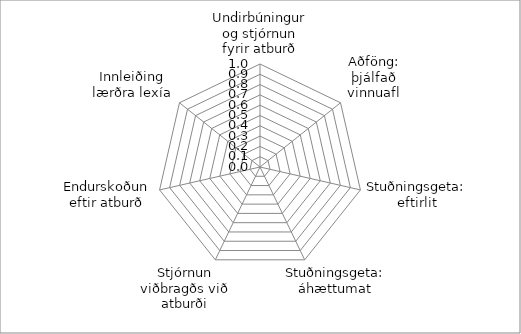
| Category | Series 0 |
|---|---|
| Undirbúningur og stjórnun fyrir atburð | 0 |
| Aðföng: þjálfað vinnuafl | 0 |
| Stuðningsgeta: eftirlit | 0 |
| Stuðningsgeta: áhættumat | 0 |
| Stjórnun viðbragðs við atburði | 0 |
| Endurskoðun eftir atburð | 0 |
| Innleiðing lærðra lexía | 0 |